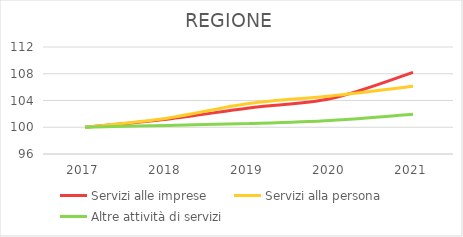
| Category | Servizi alle imprese | Servizi alla persona | Altre attività di servizi |
|---|---|---|---|
| 2017.0 | 100 | 100 | 100 |
| 2018.0 | 101.197 | 101.36 | 100.28 |
| 2019.0 | 102.886 | 103.555 | 100.56 |
| 2020.0 | 104.294 | 104.689 | 101.018 |
| 2021.0 | 108.204 | 106.116 | 101.946 |